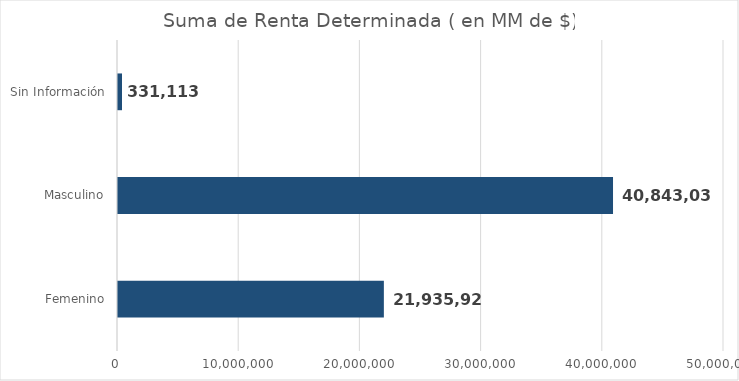
| Category | Series 0 |
|---|---|
| Femenino | 21935923.3 |
| Masculino | 40843037.1 |
| Sin Información | 331113.1 |